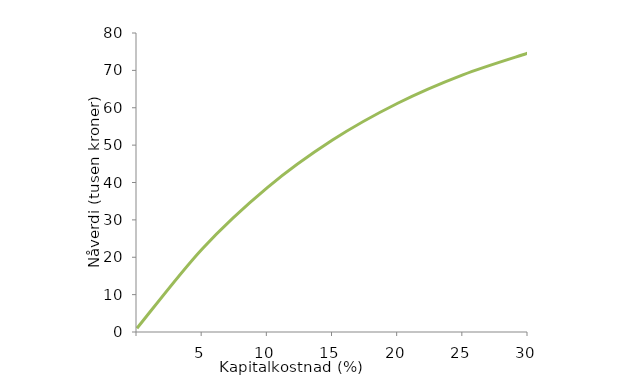
| Category | Differansekontantstrøm |
|---|---|
| nan | 0.998 |
| 5.0 | 22.229 |
| 10.0 | 38.646 |
| 15.000000000000002 | 51.361 |
| 20.0 | 61.203 |
| 25.0 | 68.799 |
| 30.0 | 74.628 |